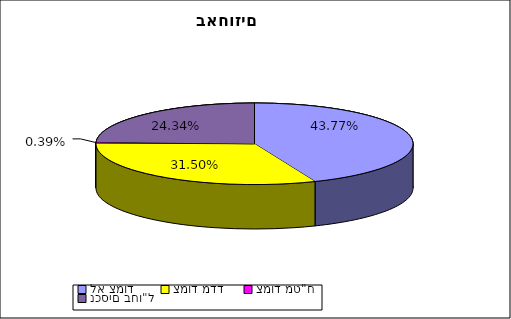
| Category | Series 1 |
|---|---|
| לא צמוד | 0.438 |
| צמוד מדד | 0.315 |
| צמוד מט"ח | 0.004 |
| נכסים בחו"ל | 0.243 |